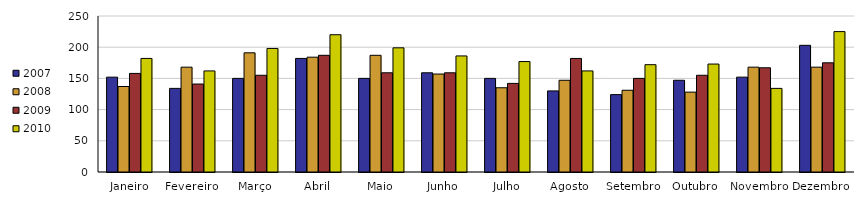
| Category | 2007 | 2008 | 2009 | 2010 |
|---|---|---|---|---|
| Janeiro | 152 | 137 | 158 | 182 |
| Fevereiro | 134 | 168 | 141 | 162 |
| Março | 150 | 191 | 155 | 198 |
| Abril | 182 | 184 | 187 | 220 |
| Maio | 150 | 187 | 159 | 199 |
| Junho | 159 | 157 | 159 | 186 |
| Julho | 150 | 135 | 142 | 177 |
| Agosto | 130 | 147 | 182 | 162 |
| Setembro | 124 | 131 | 150 | 172 |
| Outubro | 147 | 128 | 155 | 173 |
| Novembro | 152 | 168 | 167 | 134 |
| Dezembro | 203 | 168 | 175 | 225 |